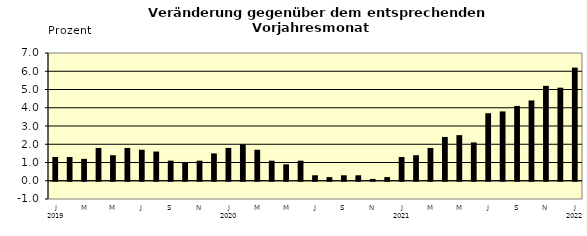
| Category | Series 0 |
|---|---|
| 0 | 1.3 |
| 1 | 1.3 |
| 2 | 1.2 |
| 3 | 1.8 |
| 4 | 1.4 |
| 5 | 1.8 |
| 6 | 1.7 |
| 7 | 1.6 |
| 8 | 1.1 |
| 9 | 1 |
| 10 | 1.1 |
| 11 | 1.5 |
| 12 | 1.8 |
| 13 | 2 |
| 14 | 1.7 |
| 15 | 1.1 |
| 16 | 0.9 |
| 17 | 1.1 |
| 18 | 0.3 |
| 19 | 0.2 |
| 20 | 0.3 |
| 21 | 0.3 |
| 22 | 0.1 |
| 23 | 0.2 |
| 24 | 1.3 |
| 25 | 1.4 |
| 26 | 1.8 |
| 27 | 2.4 |
| 28 | 2.5 |
| 29 | 2.1 |
| 30 | 3.7 |
| 31 | 3.8 |
| 32 | 4.1 |
| 33 | 4.4 |
| 34 | 5.2 |
| 35 | 5.1 |
| 36 | 6.2 |